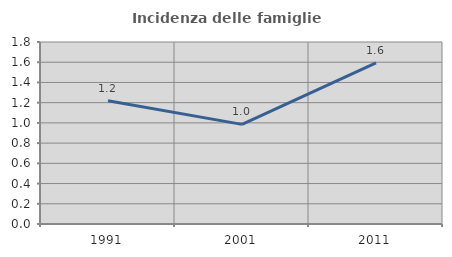
| Category | Incidenza delle famiglie numerose |
|---|---|
| 1991.0 | 1.22 |
| 2001.0 | 0.985 |
| 2011.0 | 1.594 |